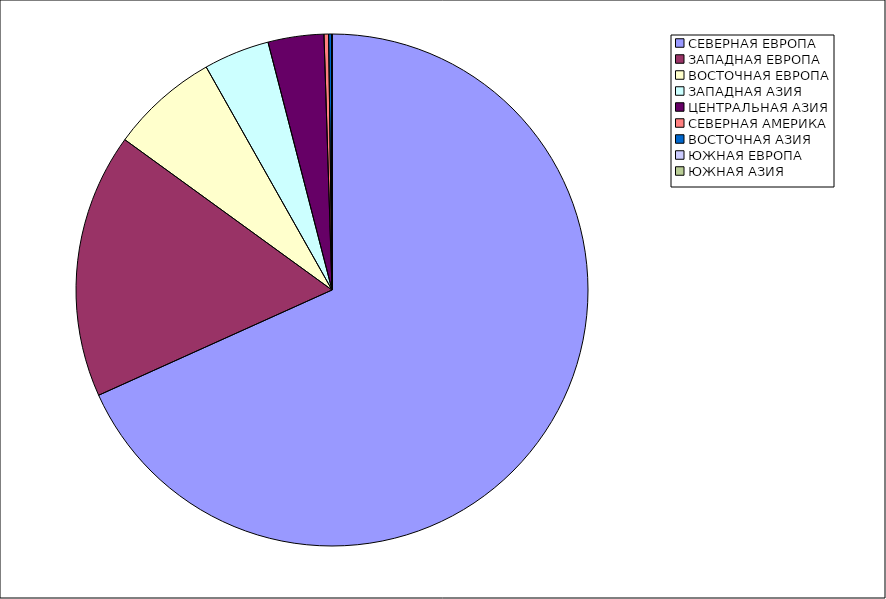
| Category | Оборот |
|---|---|
| СЕВЕРНАЯ ЕВРОПА | 68.256 |
| ЗАПАДНАЯ ЕВРОПА | 16.734 |
| ВОСТОЧНАЯ ЕВРОПА | 6.834 |
| ЗАПАДНАЯ АЗИЯ | 4.153 |
| ЦЕНТРАЛЬНАЯ АЗИЯ | 3.523 |
| СЕВЕРНАЯ АМЕРИКА | 0.288 |
| ВОСТОЧНАЯ АЗИЯ | 0.211 |
| ЮЖНАЯ ЕВРОПА | 0.002 |
| ЮЖНАЯ АЗИЯ | 0 |